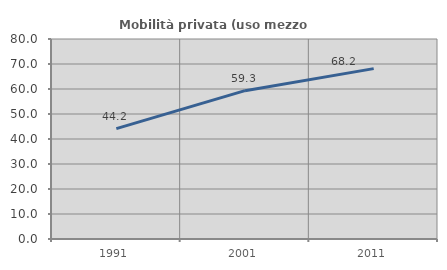
| Category | Mobilità privata (uso mezzo privato) |
|---|---|
| 1991.0 | 44.157 |
| 2001.0 | 59.331 |
| 2011.0 | 68.153 |